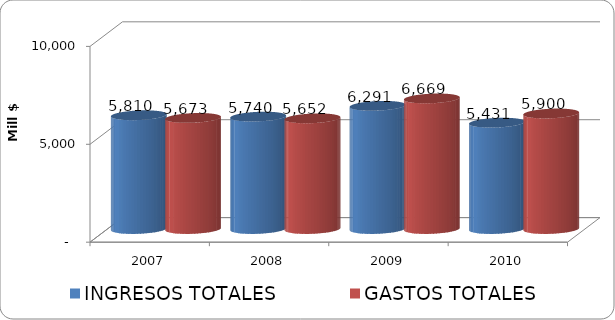
| Category | INGRESOS TOTALES | GASTOS TOTALES |
|---|---|---|
| 2007 | 5810.27 | 5673.171 |
| 2008 | 5740.482 | 5652.086 |
| 2009 | 6291.307 | 6668.909 |
| 2010 | 5431 | 5900 |